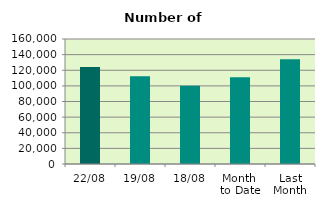
| Category | Series 0 |
|---|---|
| 22/08 | 124136 |
| 19/08 | 112164 |
| 18/08 | 100006 |
| Month 
to Date | 110953.25 |
| Last
Month | 134197.333 |